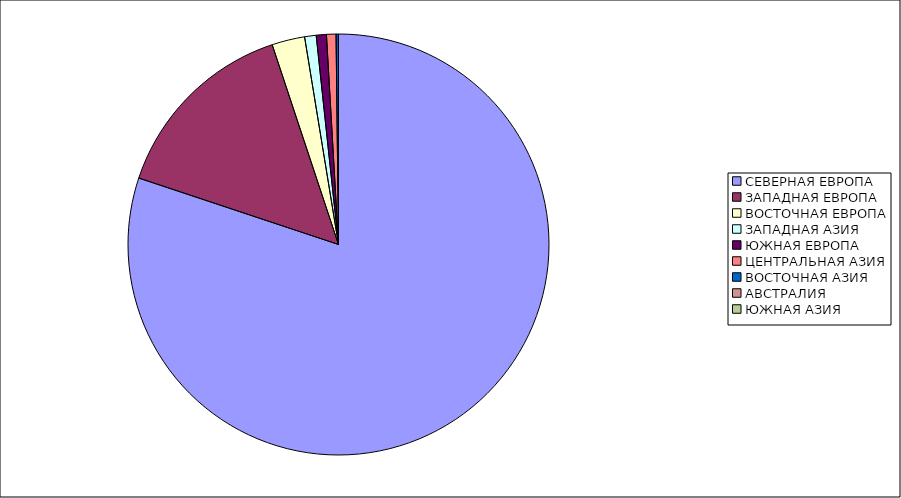
| Category | Оборот |
|---|---|
| СЕВЕРНАЯ ЕВРОПА | 80.111 |
| ЗАПАДНАЯ ЕВРОПА | 14.788 |
| ВОСТОЧНАЯ ЕВРОПА | 2.522 |
| ЗАПАДНАЯ АЗИЯ | 0.886 |
| ЮЖНАЯ ЕВРОПА | 0.779 |
| ЦЕНТРАЛЬНАЯ АЗИЯ | 0.728 |
| ВОСТОЧНАЯ АЗИЯ | 0.181 |
| АВСТРАЛИЯ | 0.003 |
| ЮЖНАЯ АЗИЯ | 0.001 |